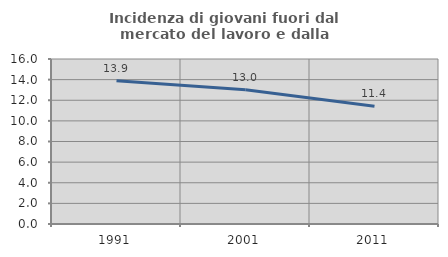
| Category | Incidenza di giovani fuori dal mercato del lavoro e dalla formazione  |
|---|---|
| 1991.0 | 13.891 |
| 2001.0 | 13.028 |
| 2011.0 | 11.408 |